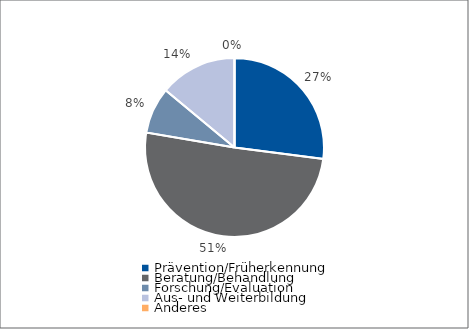
| Category | Series 0 |
|---|---|
| Prävention/Früherkennung | 1406 |
| Beratung/Behandlung | 2633 |
| Forschung/Evaluation | 435 |
| Aus- und Weiterbildung | 726 |
| Anderes | 0 |